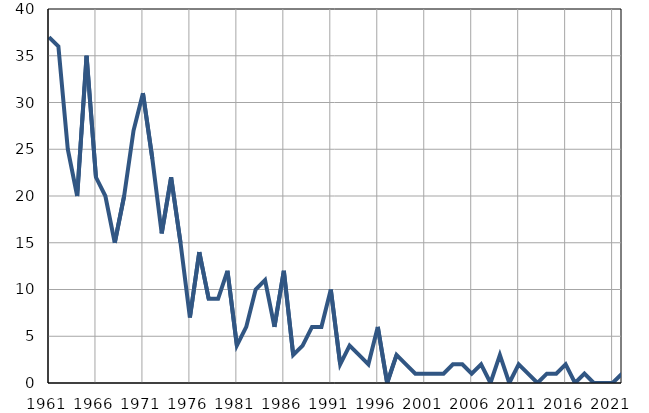
| Category | Умрла 
одојчад |
|---|---|
| 1961.0 | 37 |
| 1962.0 | 36 |
| 1963.0 | 25 |
| 1964.0 | 20 |
| 1965.0 | 35 |
| 1966.0 | 22 |
| 1967.0 | 20 |
| 1968.0 | 15 |
| 1969.0 | 20 |
| 1970.0 | 27 |
| 1971.0 | 31 |
| 1972.0 | 24 |
| 1973.0 | 16 |
| 1974.0 | 22 |
| 1975.0 | 15 |
| 1976.0 | 7 |
| 1977.0 | 14 |
| 1978.0 | 9 |
| 1979.0 | 9 |
| 1980.0 | 12 |
| 1981.0 | 4 |
| 1982.0 | 6 |
| 1983.0 | 10 |
| 1984.0 | 11 |
| 1985.0 | 6 |
| 1986.0 | 12 |
| 1987.0 | 3 |
| 1988.0 | 4 |
| 1989.0 | 6 |
| 1990.0 | 6 |
| 1991.0 | 10 |
| 1992.0 | 2 |
| 1993.0 | 4 |
| 1994.0 | 3 |
| 1995.0 | 2 |
| 1996.0 | 6 |
| 1997.0 | 0 |
| 1998.0 | 3 |
| 1999.0 | 2 |
| 2000.0 | 1 |
| 2001.0 | 1 |
| 2002.0 | 1 |
| 2003.0 | 1 |
| 2004.0 | 2 |
| 2005.0 | 2 |
| 2006.0 | 1 |
| 2007.0 | 2 |
| 2008.0 | 0 |
| 2009.0 | 3 |
| 2010.0 | 0 |
| 2011.0 | 2 |
| 2012.0 | 1 |
| 2013.0 | 0 |
| 2014.0 | 1 |
| 2015.0 | 1 |
| 2016.0 | 2 |
| 2017.0 | 0 |
| 2018.0 | 1 |
| 2019.0 | 0 |
| 2020.0 | 0 |
| 2021.0 | 0 |
| 2022.0 | 1 |